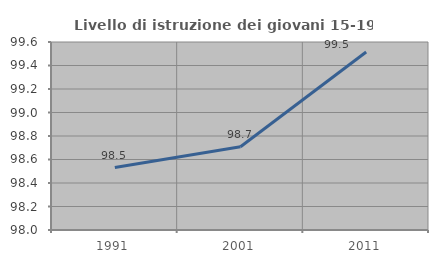
| Category | Livello di istruzione dei giovani 15-19 anni |
|---|---|
| 1991.0 | 98.531 |
| 2001.0 | 98.708 |
| 2011.0 | 99.515 |